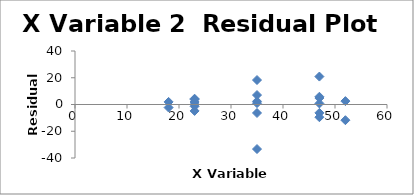
| Category | Series 0 |
|---|---|
| 18.0 | 1.94 |
| 35.0 | 2.349 |
| 52.0 | 2.531 |
| 52.0 | -11.733 |
| 18.0 | -2.284 |
| 35.0 | -6.347 |
| 35.0 | 0.997 |
| 35.0 | -33.296 |
| 23.0 | 3.78 |
| 23.0 | 0.105 |
| 47.0 | 0.781 |
| 47.0 | -6.272 |
| 47.0 | -9.504 |
| 23.0 | 4.345 |
| 23.0 | -1.34 |
| 23.0 | 1.876 |
| 23.0 | -4.808 |
| 47.0 | 5.789 |
| 47.0 | 4.832 |
| 47.0 | 20.883 |
| 35.0 | 18.301 |
| 35.0 | 7.076 |